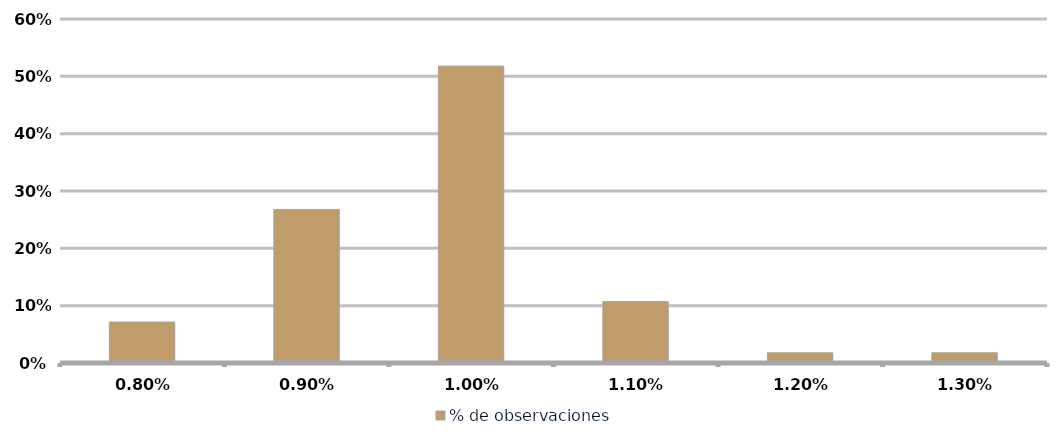
| Category | % de observaciones  |
|---|---|
| 0.008 | 0.071 |
| 0.009000000000000001 | 0.268 |
| 0.01 | 0.518 |
| 0.011 | 0.107 |
| 0.012 | 0.018 |
| 0.013000000000000001 | 0.018 |